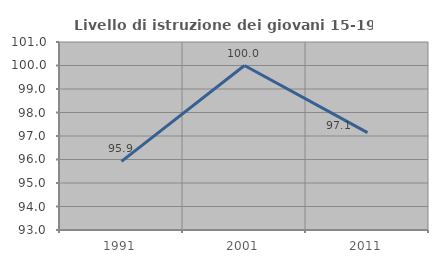
| Category | Livello di istruzione dei giovani 15-19 anni |
|---|---|
| 1991.0 | 95.918 |
| 2001.0 | 100 |
| 2011.0 | 97.143 |